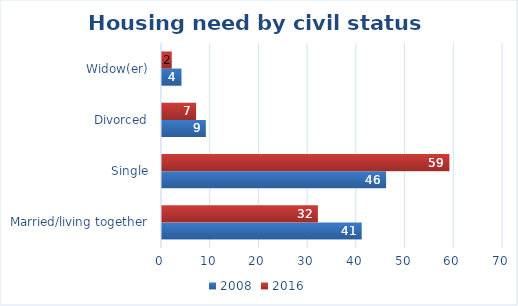
| Category | 2008 | 2016 |
|---|---|---|
| Married/living together | 41 | 32 |
| Single | 46 | 59 |
| Divorced | 9 | 7 |
| Widow(er) | 4 | 2 |